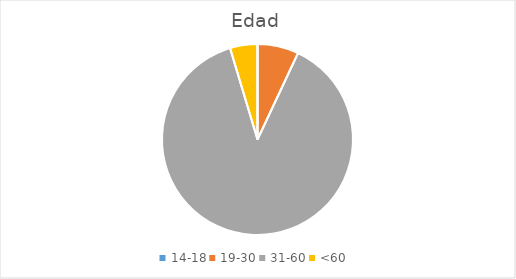
| Category | Series 0 |
|---|---|
| 14-18 | 0 |
| 19-30 | 6 |
| 31-60 | 76 |
| <60 | 4 |